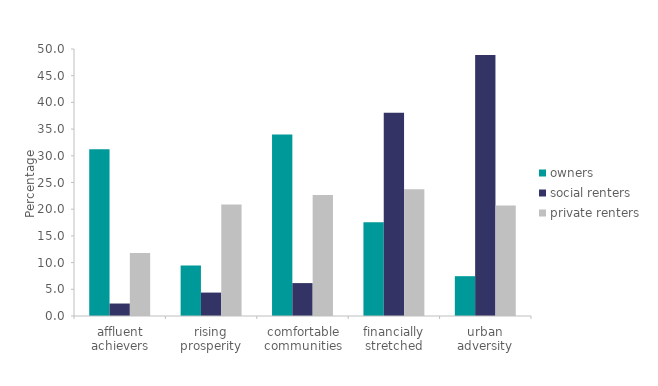
| Category | owners | social renters | private renters |
|---|---|---|---|
| affluent achievers | 31.245 | 2.337 | 11.813 |
| rising prosperity | 9.464 | 4.386 | 20.889 |
| comfortable communities | 34.005 | 6.162 | 22.677 |
| financially stretched | 17.559 | 38.081 | 23.718 |
| urban adversity | 7.456 | 48.895 | 20.693 |